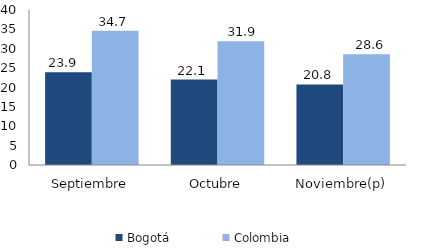
| Category | Bogotá | Colombia |
|---|---|---|
| Septiembre | 23.91 | 34.669 |
| Octubre | 22.061 | 31.904 |
| Noviembre(p) | 20.781 | 28.596 |